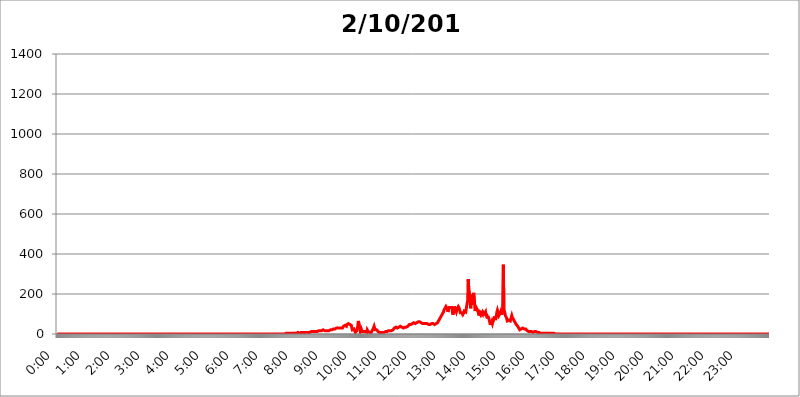
| Category | 2016.02.10 |
|---|---|
| 0.0 | 0 |
| 0.0006944444444444445 | 0 |
| 0.001388888888888889 | 0 |
| 0.0020833333333333333 | 0 |
| 0.002777777777777778 | 0 |
| 0.003472222222222222 | 0 |
| 0.004166666666666667 | 0 |
| 0.004861111111111111 | 0 |
| 0.005555555555555556 | 0 |
| 0.0062499999999999995 | 0 |
| 0.006944444444444444 | 0 |
| 0.007638888888888889 | 0 |
| 0.008333333333333333 | 0 |
| 0.009027777777777779 | 0 |
| 0.009722222222222222 | 0 |
| 0.010416666666666666 | 0 |
| 0.011111111111111112 | 0 |
| 0.011805555555555555 | 0 |
| 0.012499999999999999 | 0 |
| 0.013194444444444444 | 0 |
| 0.013888888888888888 | 0 |
| 0.014583333333333332 | 0 |
| 0.015277777777777777 | 0 |
| 0.015972222222222224 | 0 |
| 0.016666666666666666 | 0 |
| 0.017361111111111112 | 0 |
| 0.018055555555555557 | 0 |
| 0.01875 | 0 |
| 0.019444444444444445 | 0 |
| 0.02013888888888889 | 0 |
| 0.020833333333333332 | 0 |
| 0.02152777777777778 | 0 |
| 0.022222222222222223 | 0 |
| 0.02291666666666667 | 0 |
| 0.02361111111111111 | 0 |
| 0.024305555555555556 | 0 |
| 0.024999999999999998 | 0 |
| 0.025694444444444447 | 0 |
| 0.02638888888888889 | 0 |
| 0.027083333333333334 | 0 |
| 0.027777777777777776 | 0 |
| 0.02847222222222222 | 0 |
| 0.029166666666666664 | 0 |
| 0.029861111111111113 | 0 |
| 0.030555555555555555 | 0 |
| 0.03125 | 0 |
| 0.03194444444444445 | 0 |
| 0.03263888888888889 | 0 |
| 0.03333333333333333 | 0 |
| 0.034027777777777775 | 0 |
| 0.034722222222222224 | 0 |
| 0.035416666666666666 | 0 |
| 0.036111111111111115 | 0 |
| 0.03680555555555556 | 0 |
| 0.0375 | 0 |
| 0.03819444444444444 | 0 |
| 0.03888888888888889 | 0 |
| 0.03958333333333333 | 0 |
| 0.04027777777777778 | 0 |
| 0.04097222222222222 | 0 |
| 0.041666666666666664 | 0 |
| 0.042361111111111106 | 0 |
| 0.04305555555555556 | 0 |
| 0.043750000000000004 | 0 |
| 0.044444444444444446 | 0 |
| 0.04513888888888889 | 0 |
| 0.04583333333333334 | 0 |
| 0.04652777777777778 | 0 |
| 0.04722222222222222 | 0 |
| 0.04791666666666666 | 0 |
| 0.04861111111111111 | 0 |
| 0.049305555555555554 | 0 |
| 0.049999999999999996 | 0 |
| 0.05069444444444445 | 0 |
| 0.051388888888888894 | 0 |
| 0.052083333333333336 | 0 |
| 0.05277777777777778 | 0 |
| 0.05347222222222222 | 0 |
| 0.05416666666666667 | 0 |
| 0.05486111111111111 | 0 |
| 0.05555555555555555 | 0 |
| 0.05625 | 0 |
| 0.05694444444444444 | 0 |
| 0.057638888888888885 | 0 |
| 0.05833333333333333 | 0 |
| 0.05902777777777778 | 0 |
| 0.059722222222222225 | 0 |
| 0.06041666666666667 | 0 |
| 0.061111111111111116 | 0 |
| 0.06180555555555556 | 0 |
| 0.0625 | 0 |
| 0.06319444444444444 | 0 |
| 0.06388888888888888 | 0 |
| 0.06458333333333334 | 0 |
| 0.06527777777777778 | 0 |
| 0.06597222222222222 | 0 |
| 0.06666666666666667 | 0 |
| 0.06736111111111111 | 0 |
| 0.06805555555555555 | 0 |
| 0.06874999999999999 | 0 |
| 0.06944444444444443 | 0 |
| 0.07013888888888889 | 0 |
| 0.07083333333333333 | 0 |
| 0.07152777777777779 | 0 |
| 0.07222222222222223 | 0 |
| 0.07291666666666667 | 0 |
| 0.07361111111111111 | 0 |
| 0.07430555555555556 | 0 |
| 0.075 | 0 |
| 0.07569444444444444 | 0 |
| 0.0763888888888889 | 0 |
| 0.07708333333333334 | 0 |
| 0.07777777777777778 | 0 |
| 0.07847222222222222 | 0 |
| 0.07916666666666666 | 0 |
| 0.0798611111111111 | 0 |
| 0.08055555555555556 | 0 |
| 0.08125 | 0 |
| 0.08194444444444444 | 0 |
| 0.08263888888888889 | 0 |
| 0.08333333333333333 | 0 |
| 0.08402777777777777 | 0 |
| 0.08472222222222221 | 0 |
| 0.08541666666666665 | 0 |
| 0.08611111111111112 | 0 |
| 0.08680555555555557 | 0 |
| 0.08750000000000001 | 0 |
| 0.08819444444444445 | 0 |
| 0.08888888888888889 | 0 |
| 0.08958333333333333 | 0 |
| 0.09027777777777778 | 0 |
| 0.09097222222222222 | 0 |
| 0.09166666666666667 | 0 |
| 0.09236111111111112 | 0 |
| 0.09305555555555556 | 0 |
| 0.09375 | 0 |
| 0.09444444444444444 | 0 |
| 0.09513888888888888 | 0 |
| 0.09583333333333333 | 0 |
| 0.09652777777777777 | 0 |
| 0.09722222222222222 | 0 |
| 0.09791666666666667 | 0 |
| 0.09861111111111111 | 0 |
| 0.09930555555555555 | 0 |
| 0.09999999999999999 | 0 |
| 0.10069444444444443 | 0 |
| 0.1013888888888889 | 0 |
| 0.10208333333333335 | 0 |
| 0.10277777777777779 | 0 |
| 0.10347222222222223 | 0 |
| 0.10416666666666667 | 0 |
| 0.10486111111111111 | 0 |
| 0.10555555555555556 | 0 |
| 0.10625 | 0 |
| 0.10694444444444444 | 0 |
| 0.1076388888888889 | 0 |
| 0.10833333333333334 | 0 |
| 0.10902777777777778 | 0 |
| 0.10972222222222222 | 0 |
| 0.1111111111111111 | 0 |
| 0.11180555555555556 | 0 |
| 0.11180555555555556 | 0 |
| 0.1125 | 0 |
| 0.11319444444444444 | 0 |
| 0.11388888888888889 | 0 |
| 0.11458333333333333 | 0 |
| 0.11527777777777777 | 0 |
| 0.11597222222222221 | 0 |
| 0.11666666666666665 | 0 |
| 0.1173611111111111 | 0 |
| 0.11805555555555557 | 0 |
| 0.11944444444444445 | 0 |
| 0.12013888888888889 | 0 |
| 0.12083333333333333 | 0 |
| 0.12152777777777778 | 0 |
| 0.12222222222222223 | 0 |
| 0.12291666666666667 | 0 |
| 0.12291666666666667 | 0 |
| 0.12361111111111112 | 0 |
| 0.12430555555555556 | 0 |
| 0.125 | 0 |
| 0.12569444444444444 | 0 |
| 0.12638888888888888 | 0 |
| 0.12708333333333333 | 0 |
| 0.16875 | 0 |
| 0.12847222222222224 | 0 |
| 0.12916666666666668 | 0 |
| 0.12986111111111112 | 0 |
| 0.13055555555555556 | 0 |
| 0.13125 | 0 |
| 0.13194444444444445 | 0 |
| 0.1326388888888889 | 0 |
| 0.13333333333333333 | 0 |
| 0.13402777777777777 | 0 |
| 0.13402777777777777 | 0 |
| 0.13472222222222222 | 0 |
| 0.13541666666666666 | 0 |
| 0.1361111111111111 | 0 |
| 0.13749999999999998 | 0 |
| 0.13819444444444443 | 0 |
| 0.1388888888888889 | 0 |
| 0.13958333333333334 | 0 |
| 0.14027777777777778 | 0 |
| 0.14097222222222222 | 0 |
| 0.14166666666666666 | 0 |
| 0.1423611111111111 | 0 |
| 0.14305555555555557 | 0 |
| 0.14375000000000002 | 0 |
| 0.14444444444444446 | 0 |
| 0.1451388888888889 | 0 |
| 0.1451388888888889 | 0 |
| 0.14652777777777778 | 0 |
| 0.14722222222222223 | 0 |
| 0.14791666666666667 | 0 |
| 0.1486111111111111 | 0 |
| 0.14930555555555555 | 0 |
| 0.15 | 0 |
| 0.15069444444444444 | 0 |
| 0.15138888888888888 | 0 |
| 0.15208333333333332 | 0 |
| 0.15277777777777776 | 0 |
| 0.15347222222222223 | 0 |
| 0.15416666666666667 | 0 |
| 0.15486111111111112 | 0 |
| 0.15555555555555556 | 0 |
| 0.15625 | 0 |
| 0.15694444444444444 | 0 |
| 0.15763888888888888 | 0 |
| 0.15833333333333333 | 0 |
| 0.15902777777777777 | 0 |
| 0.15972222222222224 | 0 |
| 0.16041666666666668 | 0 |
| 0.16111111111111112 | 0 |
| 0.16180555555555556 | 0 |
| 0.1625 | 0 |
| 0.16319444444444445 | 0 |
| 0.1638888888888889 | 0 |
| 0.16458333333333333 | 0 |
| 0.16527777777777777 | 0 |
| 0.16597222222222222 | 0 |
| 0.16666666666666666 | 0 |
| 0.1673611111111111 | 0 |
| 0.16805555555555554 | 0 |
| 0.16874999999999998 | 0 |
| 0.16944444444444443 | 0 |
| 0.17013888888888887 | 0 |
| 0.1708333333333333 | 0 |
| 0.17152777777777775 | 0 |
| 0.17222222222222225 | 0 |
| 0.1729166666666667 | 0 |
| 0.17361111111111113 | 0 |
| 0.17430555555555557 | 0 |
| 0.17500000000000002 | 0 |
| 0.17569444444444446 | 0 |
| 0.1763888888888889 | 0 |
| 0.17708333333333334 | 0 |
| 0.17777777777777778 | 0 |
| 0.17847222222222223 | 0 |
| 0.17916666666666667 | 0 |
| 0.1798611111111111 | 0 |
| 0.18055555555555555 | 0 |
| 0.18125 | 0 |
| 0.18194444444444444 | 0 |
| 0.1826388888888889 | 0 |
| 0.18333333333333335 | 0 |
| 0.1840277777777778 | 0 |
| 0.18472222222222223 | 0 |
| 0.18541666666666667 | 0 |
| 0.18611111111111112 | 0 |
| 0.18680555555555556 | 0 |
| 0.1875 | 0 |
| 0.18819444444444444 | 0 |
| 0.18888888888888888 | 0 |
| 0.18958333333333333 | 0 |
| 0.19027777777777777 | 0 |
| 0.1909722222222222 | 0 |
| 0.19166666666666665 | 0 |
| 0.19236111111111112 | 0 |
| 0.19305555555555554 | 0 |
| 0.19375 | 0 |
| 0.19444444444444445 | 0 |
| 0.1951388888888889 | 0 |
| 0.19583333333333333 | 0 |
| 0.19652777777777777 | 0 |
| 0.19722222222222222 | 0 |
| 0.19791666666666666 | 0 |
| 0.1986111111111111 | 0 |
| 0.19930555555555554 | 0 |
| 0.19999999999999998 | 0 |
| 0.20069444444444443 | 0 |
| 0.20138888888888887 | 0 |
| 0.2020833333333333 | 0 |
| 0.2027777777777778 | 0 |
| 0.2034722222222222 | 0 |
| 0.2041666666666667 | 0 |
| 0.20486111111111113 | 0 |
| 0.20555555555555557 | 0 |
| 0.20625000000000002 | 0 |
| 0.20694444444444446 | 0 |
| 0.2076388888888889 | 0 |
| 0.20833333333333334 | 0 |
| 0.20902777777777778 | 0 |
| 0.20972222222222223 | 0 |
| 0.21041666666666667 | 0 |
| 0.2111111111111111 | 0 |
| 0.21180555555555555 | 0 |
| 0.2125 | 0 |
| 0.21319444444444444 | 0 |
| 0.2138888888888889 | 0 |
| 0.21458333333333335 | 0 |
| 0.2152777777777778 | 0 |
| 0.21597222222222223 | 0 |
| 0.21666666666666667 | 0 |
| 0.21736111111111112 | 0 |
| 0.21805555555555556 | 0 |
| 0.21875 | 0 |
| 0.21944444444444444 | 0 |
| 0.22013888888888888 | 0 |
| 0.22083333333333333 | 0 |
| 0.22152777777777777 | 0 |
| 0.2222222222222222 | 0 |
| 0.22291666666666665 | 0 |
| 0.2236111111111111 | 0 |
| 0.22430555555555556 | 0 |
| 0.225 | 0 |
| 0.22569444444444445 | 0 |
| 0.2263888888888889 | 0 |
| 0.22708333333333333 | 0 |
| 0.22777777777777777 | 0 |
| 0.22847222222222222 | 0 |
| 0.22916666666666666 | 0 |
| 0.2298611111111111 | 0 |
| 0.23055555555555554 | 0 |
| 0.23124999999999998 | 0 |
| 0.23194444444444443 | 0 |
| 0.23263888888888887 | 0 |
| 0.2333333333333333 | 0 |
| 0.2340277777777778 | 0 |
| 0.2347222222222222 | 0 |
| 0.2354166666666667 | 0 |
| 0.23611111111111113 | 0 |
| 0.23680555555555557 | 0 |
| 0.23750000000000002 | 0 |
| 0.23819444444444446 | 0 |
| 0.2388888888888889 | 0 |
| 0.23958333333333334 | 0 |
| 0.24027777777777778 | 0 |
| 0.24097222222222223 | 0 |
| 0.24166666666666667 | 0 |
| 0.2423611111111111 | 0 |
| 0.24305555555555555 | 0 |
| 0.24375 | 0 |
| 0.24444444444444446 | 0 |
| 0.24513888888888888 | 0 |
| 0.24583333333333335 | 0 |
| 0.2465277777777778 | 0 |
| 0.24722222222222223 | 0 |
| 0.24791666666666667 | 0 |
| 0.24861111111111112 | 0 |
| 0.24930555555555556 | 0 |
| 0.25 | 0 |
| 0.25069444444444444 | 0 |
| 0.2513888888888889 | 0 |
| 0.2520833333333333 | 0 |
| 0.25277777777777777 | 0 |
| 0.2534722222222222 | 0 |
| 0.25416666666666665 | 0 |
| 0.2548611111111111 | 0 |
| 0.2555555555555556 | 0 |
| 0.25625000000000003 | 0 |
| 0.2569444444444445 | 0 |
| 0.2576388888888889 | 0 |
| 0.25833333333333336 | 0 |
| 0.2590277777777778 | 0 |
| 0.25972222222222224 | 0 |
| 0.2604166666666667 | 0 |
| 0.2611111111111111 | 0 |
| 0.26180555555555557 | 0 |
| 0.2625 | 0 |
| 0.26319444444444445 | 0 |
| 0.2638888888888889 | 0 |
| 0.26458333333333334 | 0 |
| 0.2652777777777778 | 0 |
| 0.2659722222222222 | 0 |
| 0.26666666666666666 | 0 |
| 0.2673611111111111 | 0 |
| 0.26805555555555555 | 0 |
| 0.26875 | 0 |
| 0.26944444444444443 | 0 |
| 0.2701388888888889 | 0 |
| 0.2708333333333333 | 0 |
| 0.27152777777777776 | 0 |
| 0.2722222222222222 | 0 |
| 0.27291666666666664 | 0 |
| 0.2736111111111111 | 0 |
| 0.2743055555555555 | 0 |
| 0.27499999999999997 | 0 |
| 0.27569444444444446 | 0 |
| 0.27638888888888885 | 0 |
| 0.27708333333333335 | 0 |
| 0.2777777777777778 | 0 |
| 0.27847222222222223 | 0 |
| 0.2791666666666667 | 0 |
| 0.2798611111111111 | 0 |
| 0.28055555555555556 | 0 |
| 0.28125 | 0 |
| 0.28194444444444444 | 0 |
| 0.2826388888888889 | 0 |
| 0.2833333333333333 | 0 |
| 0.28402777777777777 | 0 |
| 0.2847222222222222 | 0 |
| 0.28541666666666665 | 0 |
| 0.28611111111111115 | 0 |
| 0.28680555555555554 | 0 |
| 0.28750000000000003 | 0 |
| 0.2881944444444445 | 0 |
| 0.2888888888888889 | 0 |
| 0.28958333333333336 | 0 |
| 0.2902777777777778 | 0 |
| 0.29097222222222224 | 0 |
| 0.2916666666666667 | 0 |
| 0.2923611111111111 | 0 |
| 0.29305555555555557 | 0 |
| 0.29375 | 0 |
| 0.29444444444444445 | 0 |
| 0.2951388888888889 | 0 |
| 0.29583333333333334 | 0 |
| 0.2965277777777778 | 0 |
| 0.2972222222222222 | 0 |
| 0.29791666666666666 | 0 |
| 0.2986111111111111 | 0 |
| 0.29930555555555555 | 0 |
| 0.3 | 0 |
| 0.30069444444444443 | 0 |
| 0.3013888888888889 | 0 |
| 0.3020833333333333 | 0 |
| 0.30277777777777776 | 0 |
| 0.3034722222222222 | 0 |
| 0.30416666666666664 | 0 |
| 0.3048611111111111 | 0 |
| 0.3055555555555555 | 0 |
| 0.30624999999999997 | 0 |
| 0.3069444444444444 | 0 |
| 0.3076388888888889 | 0 |
| 0.30833333333333335 | 0 |
| 0.3090277777777778 | 0 |
| 0.30972222222222223 | 0 |
| 0.3104166666666667 | 0 |
| 0.3111111111111111 | 0 |
| 0.31180555555555556 | 0 |
| 0.3125 | 0 |
| 0.31319444444444444 | 0 |
| 0.3138888888888889 | 0 |
| 0.3145833333333333 | 0 |
| 0.31527777777777777 | 0 |
| 0.3159722222222222 | 0 |
| 0.31666666666666665 | 0 |
| 0.31736111111111115 | 3.525 |
| 0.31805555555555554 | 0 |
| 0.31875000000000003 | 0 |
| 0.3194444444444445 | 0 |
| 0.3201388888888889 | 0 |
| 0.32083333333333336 | 3.525 |
| 0.3215277777777778 | 3.525 |
| 0.32222222222222224 | 3.525 |
| 0.3229166666666667 | 3.525 |
| 0.3236111111111111 | 3.525 |
| 0.32430555555555557 | 3.525 |
| 0.325 | 3.525 |
| 0.32569444444444445 | 0 |
| 0.3263888888888889 | 3.525 |
| 0.32708333333333334 | 3.525 |
| 0.3277777777777778 | 3.525 |
| 0.3284722222222222 | 3.525 |
| 0.32916666666666666 | 3.525 |
| 0.3298611111111111 | 3.525 |
| 0.33055555555555555 | 3.525 |
| 0.33125 | 3.525 |
| 0.33194444444444443 | 3.525 |
| 0.3326388888888889 | 3.525 |
| 0.3333333333333333 | 3.525 |
| 0.3340277777777778 | 3.525 |
| 0.3347222222222222 | 3.525 |
| 0.3354166666666667 | 3.525 |
| 0.3361111111111111 | 7.887 |
| 0.3368055555555556 | 7.887 |
| 0.33749999999999997 | 7.887 |
| 0.33819444444444446 | 7.887 |
| 0.33888888888888885 | 7.887 |
| 0.33958333333333335 | 3.525 |
| 0.34027777777777773 | 7.887 |
| 0.34097222222222223 | 7.887 |
| 0.3416666666666666 | 7.887 |
| 0.3423611111111111 | 7.887 |
| 0.3430555555555555 | 7.887 |
| 0.34375 | 7.887 |
| 0.3444444444444445 | 7.887 |
| 0.3451388888888889 | 7.887 |
| 0.3458333333333334 | 7.887 |
| 0.34652777777777777 | 7.887 |
| 0.34722222222222227 | 7.887 |
| 0.34791666666666665 | 7.887 |
| 0.34861111111111115 | 7.887 |
| 0.34930555555555554 | 7.887 |
| 0.35000000000000003 | 7.887 |
| 0.3506944444444444 | 12.257 |
| 0.3513888888888889 | 12.257 |
| 0.3520833333333333 | 7.887 |
| 0.3527777777777778 | 12.257 |
| 0.3534722222222222 | 12.257 |
| 0.3541666666666667 | 7.887 |
| 0.3548611111111111 | 12.257 |
| 0.35555555555555557 | 12.257 |
| 0.35625 | 12.257 |
| 0.35694444444444445 | 7.887 |
| 0.3576388888888889 | 7.887 |
| 0.35833333333333334 | 12.257 |
| 0.3590277777777778 | 12.257 |
| 0.3597222222222222 | 12.257 |
| 0.36041666666666666 | 12.257 |
| 0.3611111111111111 | 12.257 |
| 0.36180555555555555 | 12.257 |
| 0.3625 | 12.257 |
| 0.36319444444444443 | 16.636 |
| 0.3638888888888889 | 16.636 |
| 0.3645833333333333 | 12.257 |
| 0.3652777777777778 | 12.257 |
| 0.3659722222222222 | 12.257 |
| 0.3666666666666667 | 16.636 |
| 0.3673611111111111 | 16.636 |
| 0.3680555555555556 | 16.636 |
| 0.36874999999999997 | 16.636 |
| 0.36944444444444446 | 16.636 |
| 0.37013888888888885 | 16.636 |
| 0.37083333333333335 | 16.636 |
| 0.37152777777777773 | 16.636 |
| 0.37222222222222223 | 16.636 |
| 0.3729166666666666 | 21.024 |
| 0.3736111111111111 | 21.024 |
| 0.3743055555555555 | 16.636 |
| 0.375 | 16.636 |
| 0.3756944444444445 | 16.636 |
| 0.3763888888888889 | 16.636 |
| 0.3770833333333334 | 16.636 |
| 0.37777777777777777 | 16.636 |
| 0.37847222222222227 | 16.636 |
| 0.37916666666666665 | 16.636 |
| 0.37986111111111115 | 16.636 |
| 0.38055555555555554 | 16.636 |
| 0.38125000000000003 | 16.636 |
| 0.3819444444444444 | 16.636 |
| 0.3826388888888889 | 21.024 |
| 0.3833333333333333 | 21.024 |
| 0.3840277777777778 | 21.024 |
| 0.3847222222222222 | 21.024 |
| 0.3854166666666667 | 21.024 |
| 0.3861111111111111 | 21.024 |
| 0.38680555555555557 | 21.024 |
| 0.3875 | 25.419 |
| 0.38819444444444445 | 25.419 |
| 0.3888888888888889 | 21.024 |
| 0.38958333333333334 | 25.419 |
| 0.3902777777777778 | 25.419 |
| 0.3909722222222222 | 29.823 |
| 0.39166666666666666 | 29.823 |
| 0.3923611111111111 | 25.419 |
| 0.39305555555555555 | 25.419 |
| 0.39375 | 29.823 |
| 0.39444444444444443 | 29.823 |
| 0.3951388888888889 | 29.823 |
| 0.3958333333333333 | 29.823 |
| 0.3965277777777778 | 29.823 |
| 0.3972222222222222 | 29.823 |
| 0.3979166666666667 | 29.823 |
| 0.3986111111111111 | 34.234 |
| 0.3993055555555556 | 29.823 |
| 0.39999999999999997 | 29.823 |
| 0.40069444444444446 | 34.234 |
| 0.40138888888888885 | 38.653 |
| 0.40208333333333335 | 43.079 |
| 0.40277777777777773 | 43.079 |
| 0.40347222222222223 | 43.079 |
| 0.4041666666666666 | 47.511 |
| 0.4048611111111111 | 43.079 |
| 0.4055555555555555 | 38.653 |
| 0.40625 | 47.511 |
| 0.4069444444444445 | 47.511 |
| 0.4076388888888889 | 47.511 |
| 0.4083333333333334 | 51.951 |
| 0.40902777777777777 | 47.511 |
| 0.40972222222222227 | 47.511 |
| 0.41041666666666665 | 47.511 |
| 0.41111111111111115 | 47.511 |
| 0.41180555555555554 | 47.511 |
| 0.41250000000000003 | 43.079 |
| 0.4131944444444444 | 29.823 |
| 0.4138888888888889 | 21.024 |
| 0.4145833333333333 | 16.636 |
| 0.4152777777777778 | 21.024 |
| 0.4159722222222222 | 25.419 |
| 0.4166666666666667 | 29.823 |
| 0.4173611111111111 | 21.024 |
| 0.41805555555555557 | 7.887 |
| 0.41875 | 7.887 |
| 0.41944444444444445 | 7.887 |
| 0.4201388888888889 | 16.636 |
| 0.42083333333333334 | 21.024 |
| 0.4215277777777778 | 38.653 |
| 0.4222222222222222 | 65.31 |
| 0.42291666666666666 | 65.31 |
| 0.4236111111111111 | 43.079 |
| 0.42430555555555555 | 25.419 |
| 0.425 | 12.257 |
| 0.42569444444444443 | 16.636 |
| 0.4263888888888889 | 25.419 |
| 0.4270833333333333 | 29.823 |
| 0.4277777777777778 | 12.257 |
| 0.4284722222222222 | 7.887 |
| 0.4291666666666667 | 7.887 |
| 0.4298611111111111 | 12.257 |
| 0.4305555555555556 | 12.257 |
| 0.43124999999999997 | 12.257 |
| 0.43194444444444446 | 12.257 |
| 0.43263888888888885 | 12.257 |
| 0.43333333333333335 | 7.887 |
| 0.43402777777777773 | 7.887 |
| 0.43472222222222223 | 21.024 |
| 0.4354166666666666 | 16.636 |
| 0.4361111111111111 | 12.257 |
| 0.4368055555555555 | 12.257 |
| 0.4375 | 12.257 |
| 0.4381944444444445 | 7.887 |
| 0.4388888888888889 | 7.887 |
| 0.4395833333333334 | 7.887 |
| 0.44027777777777777 | 7.887 |
| 0.44097222222222227 | 12.257 |
| 0.44166666666666665 | 16.636 |
| 0.44236111111111115 | 21.024 |
| 0.44305555555555554 | 25.419 |
| 0.44375000000000003 | 29.823 |
| 0.4444444444444444 | 38.653 |
| 0.4451388888888889 | 29.823 |
| 0.4458333333333333 | 21.024 |
| 0.4465277777777778 | 21.024 |
| 0.4472222222222222 | 21.024 |
| 0.4479166666666667 | 21.024 |
| 0.4486111111111111 | 16.636 |
| 0.44930555555555557 | 16.636 |
| 0.45 | 12.257 |
| 0.45069444444444445 | 7.887 |
| 0.4513888888888889 | 7.887 |
| 0.45208333333333334 | 7.887 |
| 0.4527777777777778 | 7.887 |
| 0.4534722222222222 | 7.887 |
| 0.45416666666666666 | 7.887 |
| 0.4548611111111111 | 7.887 |
| 0.45555555555555555 | 7.887 |
| 0.45625 | 7.887 |
| 0.45694444444444443 | 7.887 |
| 0.4576388888888889 | 7.887 |
| 0.4583333333333333 | 7.887 |
| 0.4590277777777778 | 7.887 |
| 0.4597222222222222 | 7.887 |
| 0.4604166666666667 | 12.257 |
| 0.4611111111111111 | 12.257 |
| 0.4618055555555556 | 12.257 |
| 0.46249999999999997 | 12.257 |
| 0.46319444444444446 | 12.257 |
| 0.46388888888888885 | 16.636 |
| 0.46458333333333335 | 16.636 |
| 0.46527777777777773 | 16.636 |
| 0.46597222222222223 | 16.636 |
| 0.4666666666666666 | 16.636 |
| 0.4673611111111111 | 16.636 |
| 0.4680555555555555 | 16.636 |
| 0.46875 | 16.636 |
| 0.4694444444444445 | 21.024 |
| 0.4701388888888889 | 21.024 |
| 0.4708333333333334 | 21.024 |
| 0.47152777777777777 | 25.419 |
| 0.47222222222222227 | 25.419 |
| 0.47291666666666665 | 29.823 |
| 0.47361111111111115 | 29.823 |
| 0.47430555555555554 | 34.234 |
| 0.47500000000000003 | 34.234 |
| 0.4756944444444444 | 34.234 |
| 0.4763888888888889 | 34.234 |
| 0.4770833333333333 | 29.823 |
| 0.4777777777777778 | 29.823 |
| 0.4784722222222222 | 29.823 |
| 0.4791666666666667 | 34.234 |
| 0.4798611111111111 | 34.234 |
| 0.48055555555555557 | 38.653 |
| 0.48125 | 38.653 |
| 0.48194444444444445 | 38.653 |
| 0.4826388888888889 | 34.234 |
| 0.48333333333333334 | 34.234 |
| 0.4840277777777778 | 34.234 |
| 0.4847222222222222 | 34.234 |
| 0.48541666666666666 | 29.823 |
| 0.4861111111111111 | 29.823 |
| 0.48680555555555555 | 29.823 |
| 0.4875 | 34.234 |
| 0.48819444444444443 | 34.234 |
| 0.4888888888888889 | 34.234 |
| 0.4895833333333333 | 34.234 |
| 0.4902777777777778 | 34.234 |
| 0.4909722222222222 | 38.653 |
| 0.4916666666666667 | 38.653 |
| 0.4923611111111111 | 43.079 |
| 0.4930555555555556 | 43.079 |
| 0.49374999999999997 | 47.511 |
| 0.49444444444444446 | 47.511 |
| 0.49513888888888885 | 47.511 |
| 0.49583333333333335 | 47.511 |
| 0.49652777777777773 | 51.951 |
| 0.49722222222222223 | 51.951 |
| 0.4979166666666666 | 51.951 |
| 0.4986111111111111 | 51.951 |
| 0.4993055555555555 | 51.951 |
| 0.5 | 56.398 |
| 0.5006944444444444 | 51.951 |
| 0.5013888888888889 | 51.951 |
| 0.5020833333333333 | 51.951 |
| 0.5027777777777778 | 51.951 |
| 0.5034722222222222 | 51.951 |
| 0.5041666666666667 | 56.398 |
| 0.5048611111111111 | 56.398 |
| 0.5055555555555555 | 60.85 |
| 0.50625 | 60.85 |
| 0.5069444444444444 | 60.85 |
| 0.5076388888888889 | 60.85 |
| 0.5083333333333333 | 60.85 |
| 0.5090277777777777 | 56.398 |
| 0.5097222222222222 | 56.398 |
| 0.5104166666666666 | 56.398 |
| 0.5111111111111112 | 56.398 |
| 0.5118055555555555 | 56.398 |
| 0.5125000000000001 | 51.951 |
| 0.5131944444444444 | 51.951 |
| 0.513888888888889 | 51.951 |
| 0.5145833333333333 | 51.951 |
| 0.5152777777777778 | 51.951 |
| 0.5159722222222222 | 51.951 |
| 0.5166666666666667 | 51.951 |
| 0.517361111111111 | 51.951 |
| 0.5180555555555556 | 51.951 |
| 0.5187499999999999 | 51.951 |
| 0.5194444444444445 | 47.511 |
| 0.5201388888888888 | 47.511 |
| 0.5208333333333334 | 47.511 |
| 0.5215277777777778 | 47.511 |
| 0.5222222222222223 | 47.511 |
| 0.5229166666666667 | 47.511 |
| 0.5236111111111111 | 47.511 |
| 0.5243055555555556 | 47.511 |
| 0.525 | 51.951 |
| 0.5256944444444445 | 51.951 |
| 0.5263888888888889 | 51.951 |
| 0.5270833333333333 | 51.951 |
| 0.5277777777777778 | 51.951 |
| 0.5284722222222222 | 51.951 |
| 0.5291666666666667 | 47.511 |
| 0.5298611111111111 | 47.511 |
| 0.5305555555555556 | 47.511 |
| 0.53125 | 51.951 |
| 0.5319444444444444 | 56.398 |
| 0.5326388888888889 | 56.398 |
| 0.5333333333333333 | 56.398 |
| 0.5340277777777778 | 60.85 |
| 0.5347222222222222 | 65.31 |
| 0.5354166666666667 | 69.775 |
| 0.5361111111111111 | 69.775 |
| 0.5368055555555555 | 78.722 |
| 0.5375 | 83.205 |
| 0.5381944444444444 | 87.692 |
| 0.5388888888888889 | 92.184 |
| 0.5395833333333333 | 96.682 |
| 0.5402777777777777 | 96.682 |
| 0.5409722222222222 | 101.184 |
| 0.5416666666666666 | 110.201 |
| 0.5423611111111112 | 119.235 |
| 0.5430555555555555 | 123.758 |
| 0.5437500000000001 | 128.284 |
| 0.5444444444444444 | 132.814 |
| 0.545138888888889 | 137.347 |
| 0.5458333333333333 | 141.884 |
| 0.5465277777777778 | 141.884 |
| 0.5472222222222222 | 123.758 |
| 0.5479166666666667 | 110.201 |
| 0.548611111111111 | 119.235 |
| 0.5493055555555556 | 132.814 |
| 0.5499999999999999 | 137.347 |
| 0.5506944444444445 | 137.347 |
| 0.5513888888888888 | 132.814 |
| 0.5520833333333334 | 132.814 |
| 0.5527777777777778 | 137.347 |
| 0.5534722222222223 | 132.814 |
| 0.5541666666666667 | 114.716 |
| 0.5548611111111111 | 96.682 |
| 0.5555555555555556 | 101.184 |
| 0.55625 | 119.235 |
| 0.5569444444444445 | 137.347 |
| 0.5576388888888889 | 132.814 |
| 0.5583333333333333 | 123.758 |
| 0.5590277777777778 | 119.235 |
| 0.5597222222222222 | 110.201 |
| 0.5604166666666667 | 114.716 |
| 0.5611111111111111 | 128.284 |
| 0.5618055555555556 | 128.284 |
| 0.5625 | 137.347 |
| 0.5631944444444444 | 137.347 |
| 0.5638888888888889 | 128.284 |
| 0.5645833333333333 | 119.235 |
| 0.5652777777777778 | 105.69 |
| 0.5659722222222222 | 105.69 |
| 0.5666666666666667 | 110.201 |
| 0.5673611111111111 | 105.69 |
| 0.5680555555555555 | 101.184 |
| 0.56875 | 96.682 |
| 0.5694444444444444 | 101.184 |
| 0.5701388888888889 | 105.69 |
| 0.5708333333333333 | 114.716 |
| 0.5715277777777777 | 110.201 |
| 0.5722222222222222 | 119.235 |
| 0.5729166666666666 | 110.201 |
| 0.5736111111111112 | 114.716 |
| 0.5743055555555555 | 141.884 |
| 0.5750000000000001 | 137.347 |
| 0.5756944444444444 | 169.156 |
| 0.576388888888889 | 274.047 |
| 0.5770833333333333 | 233 |
| 0.5777777777777778 | 228.436 |
| 0.5784722222222222 | 196.497 |
| 0.5791666666666667 | 155.509 |
| 0.579861111111111 | 128.284 |
| 0.5805555555555556 | 164.605 |
| 0.5812499999999999 | 196.497 |
| 0.5819444444444445 | 146.423 |
| 0.5826388888888888 | 169.156 |
| 0.5833333333333334 | 196.497 |
| 0.5840277777777778 | 205.62 |
| 0.5847222222222223 | 201.058 |
| 0.5854166666666667 | 146.423 |
| 0.5861111111111111 | 114.716 |
| 0.5868055555555556 | 110.201 |
| 0.5875 | 132.814 |
| 0.5881944444444445 | 132.814 |
| 0.5888888888888889 | 123.758 |
| 0.5895833333333333 | 119.235 |
| 0.5902777777777778 | 110.201 |
| 0.5909722222222222 | 101.184 |
| 0.5916666666666667 | 92.184 |
| 0.5923611111111111 | 105.69 |
| 0.5930555555555556 | 110.201 |
| 0.59375 | 96.682 |
| 0.5944444444444444 | 105.69 |
| 0.5951388888888889 | 101.184 |
| 0.5958333333333333 | 110.201 |
| 0.5965277777777778 | 96.682 |
| 0.5972222222222222 | 110.201 |
| 0.5979166666666667 | 110.201 |
| 0.5986111111111111 | 110.201 |
| 0.5993055555555555 | 101.184 |
| 0.6 | 96.682 |
| 0.6006944444444444 | 110.201 |
| 0.6013888888888889 | 92.184 |
| 0.6020833333333333 | 101.184 |
| 0.6027777777777777 | 83.205 |
| 0.6034722222222222 | 87.692 |
| 0.6041666666666666 | 83.205 |
| 0.6048611111111112 | 83.205 |
| 0.6055555555555555 | 74.246 |
| 0.6062500000000001 | 65.31 |
| 0.6069444444444444 | 51.951 |
| 0.607638888888889 | 51.951 |
| 0.6083333333333333 | 47.511 |
| 0.6090277777777778 | 51.951 |
| 0.6097222222222222 | 60.85 |
| 0.6104166666666667 | 51.951 |
| 0.611111111111111 | 60.85 |
| 0.6118055555555556 | 65.31 |
| 0.6124999999999999 | 74.246 |
| 0.6131944444444445 | 87.692 |
| 0.6138888888888888 | 83.205 |
| 0.6145833333333334 | 69.775 |
| 0.6152777777777778 | 74.246 |
| 0.6159722222222223 | 92.184 |
| 0.6166666666666667 | 110.201 |
| 0.6173611111111111 | 119.235 |
| 0.6180555555555556 | 110.201 |
| 0.61875 | 105.69 |
| 0.6194444444444445 | 92.184 |
| 0.6201388888888889 | 92.184 |
| 0.6208333333333333 | 101.184 |
| 0.6215277777777778 | 101.184 |
| 0.6222222222222222 | 114.716 |
| 0.6229166666666667 | 105.69 |
| 0.6236111111111111 | 96.682 |
| 0.6243055555555556 | 114.716 |
| 0.625 | 105.69 |
| 0.6256944444444444 | 346.682 |
| 0.6263888888888889 | 123.758 |
| 0.6270833333333333 | 119.235 |
| 0.6277777777777778 | 105.69 |
| 0.6284722222222222 | 92.184 |
| 0.6291666666666667 | 87.692 |
| 0.6298611111111111 | 83.205 |
| 0.6305555555555555 | 74.246 |
| 0.63125 | 65.31 |
| 0.6319444444444444 | 60.85 |
| 0.6326388888888889 | 69.775 |
| 0.6333333333333333 | 69.775 |
| 0.6340277777777777 | 65.31 |
| 0.6347222222222222 | 65.31 |
| 0.6354166666666666 | 65.31 |
| 0.6361111111111112 | 74.246 |
| 0.6368055555555555 | 78.722 |
| 0.6375000000000001 | 92.184 |
| 0.6381944444444444 | 83.205 |
| 0.638888888888889 | 78.722 |
| 0.6395833333333333 | 74.246 |
| 0.6402777777777778 | 69.775 |
| 0.6409722222222222 | 65.31 |
| 0.6416666666666667 | 60.85 |
| 0.642361111111111 | 56.398 |
| 0.6430555555555556 | 51.951 |
| 0.6437499999999999 | 47.511 |
| 0.6444444444444445 | 43.079 |
| 0.6451388888888888 | 43.079 |
| 0.6458333333333334 | 38.653 |
| 0.6465277777777778 | 34.234 |
| 0.6472222222222223 | 29.823 |
| 0.6479166666666667 | 25.419 |
| 0.6486111111111111 | 21.024 |
| 0.6493055555555556 | 21.024 |
| 0.65 | 25.419 |
| 0.6506944444444445 | 25.419 |
| 0.6513888888888889 | 25.419 |
| 0.6520833333333333 | 29.823 |
| 0.6527777777777778 | 29.823 |
| 0.6534722222222222 | 25.419 |
| 0.6541666666666667 | 25.419 |
| 0.6548611111111111 | 25.419 |
| 0.6555555555555556 | 25.419 |
| 0.65625 | 21.024 |
| 0.6569444444444444 | 25.419 |
| 0.6576388888888889 | 21.024 |
| 0.6583333333333333 | 21.024 |
| 0.6590277777777778 | 16.636 |
| 0.6597222222222222 | 12.257 |
| 0.6604166666666667 | 12.257 |
| 0.6611111111111111 | 12.257 |
| 0.6618055555555555 | 12.257 |
| 0.6625 | 12.257 |
| 0.6631944444444444 | 12.257 |
| 0.6638888888888889 | 12.257 |
| 0.6645833333333333 | 12.257 |
| 0.6652777777777777 | 12.257 |
| 0.6659722222222222 | 12.257 |
| 0.6666666666666666 | 7.887 |
| 0.6673611111111111 | 7.887 |
| 0.6680555555555556 | 7.887 |
| 0.6687500000000001 | 12.257 |
| 0.6694444444444444 | 12.257 |
| 0.6701388888888888 | 12.257 |
| 0.6708333333333334 | 12.257 |
| 0.6715277777777778 | 12.257 |
| 0.6722222222222222 | 7.887 |
| 0.6729166666666666 | 7.887 |
| 0.6736111111111112 | 7.887 |
| 0.6743055555555556 | 7.887 |
| 0.6749999999999999 | 7.887 |
| 0.6756944444444444 | 7.887 |
| 0.6763888888888889 | 7.887 |
| 0.6770833333333334 | 3.525 |
| 0.6777777777777777 | 3.525 |
| 0.6784722222222223 | 7.887 |
| 0.6791666666666667 | 3.525 |
| 0.6798611111111111 | 3.525 |
| 0.6805555555555555 | 7.887 |
| 0.68125 | 3.525 |
| 0.6819444444444445 | 3.525 |
| 0.6826388888888889 | 3.525 |
| 0.6833333333333332 | 3.525 |
| 0.6840277777777778 | 3.525 |
| 0.6847222222222222 | 3.525 |
| 0.6854166666666667 | 3.525 |
| 0.686111111111111 | 3.525 |
| 0.6868055555555556 | 3.525 |
| 0.6875 | 3.525 |
| 0.6881944444444444 | 3.525 |
| 0.688888888888889 | 3.525 |
| 0.6895833333333333 | 3.525 |
| 0.6902777777777778 | 3.525 |
| 0.6909722222222222 | 3.525 |
| 0.6916666666666668 | 3.525 |
| 0.6923611111111111 | 3.525 |
| 0.6930555555555555 | 3.525 |
| 0.69375 | 3.525 |
| 0.6944444444444445 | 3.525 |
| 0.6951388888888889 | 3.525 |
| 0.6958333333333333 | 3.525 |
| 0.6965277777777777 | 3.525 |
| 0.6972222222222223 | 0 |
| 0.6979166666666666 | 0 |
| 0.6986111111111111 | 0 |
| 0.6993055555555556 | 0 |
| 0.7000000000000001 | 0 |
| 0.7006944444444444 | 0 |
| 0.7013888888888888 | 0 |
| 0.7020833333333334 | 0 |
| 0.7027777777777778 | 0 |
| 0.7034722222222222 | 0 |
| 0.7041666666666666 | 0 |
| 0.7048611111111112 | 0 |
| 0.7055555555555556 | 0 |
| 0.7062499999999999 | 0 |
| 0.7069444444444444 | 0 |
| 0.7076388888888889 | 0 |
| 0.7083333333333334 | 0 |
| 0.7090277777777777 | 0 |
| 0.7097222222222223 | 0 |
| 0.7104166666666667 | 0 |
| 0.7111111111111111 | 0 |
| 0.7118055555555555 | 0 |
| 0.7125 | 0 |
| 0.7131944444444445 | 0 |
| 0.7138888888888889 | 0 |
| 0.7145833333333332 | 0 |
| 0.7152777777777778 | 0 |
| 0.7159722222222222 | 0 |
| 0.7166666666666667 | 0 |
| 0.717361111111111 | 0 |
| 0.7180555555555556 | 0 |
| 0.71875 | 0 |
| 0.7194444444444444 | 0 |
| 0.720138888888889 | 0 |
| 0.7208333333333333 | 0 |
| 0.7215277777777778 | 0 |
| 0.7222222222222222 | 0 |
| 0.7229166666666668 | 0 |
| 0.7236111111111111 | 0 |
| 0.7243055555555555 | 0 |
| 0.725 | 0 |
| 0.7256944444444445 | 0 |
| 0.7263888888888889 | 0 |
| 0.7270833333333333 | 0 |
| 0.7277777777777777 | 0 |
| 0.7284722222222223 | 0 |
| 0.7291666666666666 | 0 |
| 0.7298611111111111 | 0 |
| 0.7305555555555556 | 0 |
| 0.7312500000000001 | 0 |
| 0.7319444444444444 | 0 |
| 0.7326388888888888 | 0 |
| 0.7333333333333334 | 0 |
| 0.7340277777777778 | 0 |
| 0.7347222222222222 | 0 |
| 0.7354166666666666 | 0 |
| 0.7361111111111112 | 0 |
| 0.7368055555555556 | 0 |
| 0.7374999999999999 | 0 |
| 0.7381944444444444 | 0 |
| 0.7388888888888889 | 0 |
| 0.7395833333333334 | 0 |
| 0.7402777777777777 | 0 |
| 0.7409722222222223 | 0 |
| 0.7416666666666667 | 0 |
| 0.7423611111111111 | 0 |
| 0.7430555555555555 | 0 |
| 0.74375 | 0 |
| 0.7444444444444445 | 0 |
| 0.7451388888888889 | 0 |
| 0.7458333333333332 | 0 |
| 0.7465277777777778 | 0 |
| 0.7472222222222222 | 0 |
| 0.7479166666666667 | 0 |
| 0.748611111111111 | 0 |
| 0.7493055555555556 | 0 |
| 0.75 | 0 |
| 0.7506944444444444 | 0 |
| 0.751388888888889 | 0 |
| 0.7520833333333333 | 0 |
| 0.7527777777777778 | 0 |
| 0.7534722222222222 | 0 |
| 0.7541666666666668 | 0 |
| 0.7548611111111111 | 0 |
| 0.7555555555555555 | 0 |
| 0.75625 | 0 |
| 0.7569444444444445 | 0 |
| 0.7576388888888889 | 0 |
| 0.7583333333333333 | 0 |
| 0.7590277777777777 | 0 |
| 0.7597222222222223 | 0 |
| 0.7604166666666666 | 0 |
| 0.7611111111111111 | 0 |
| 0.7618055555555556 | 0 |
| 0.7625000000000001 | 0 |
| 0.7631944444444444 | 0 |
| 0.7638888888888888 | 0 |
| 0.7645833333333334 | 0 |
| 0.7652777777777778 | 0 |
| 0.7659722222222222 | 0 |
| 0.7666666666666666 | 0 |
| 0.7673611111111112 | 0 |
| 0.7680555555555556 | 0 |
| 0.7687499999999999 | 0 |
| 0.7694444444444444 | 0 |
| 0.7701388888888889 | 0 |
| 0.7708333333333334 | 0 |
| 0.7715277777777777 | 0 |
| 0.7722222222222223 | 0 |
| 0.7729166666666667 | 0 |
| 0.7736111111111111 | 0 |
| 0.7743055555555555 | 0 |
| 0.775 | 0 |
| 0.7756944444444445 | 0 |
| 0.7763888888888889 | 0 |
| 0.7770833333333332 | 0 |
| 0.7777777777777778 | 0 |
| 0.7784722222222222 | 0 |
| 0.7791666666666667 | 0 |
| 0.779861111111111 | 0 |
| 0.7805555555555556 | 0 |
| 0.78125 | 0 |
| 0.7819444444444444 | 0 |
| 0.782638888888889 | 0 |
| 0.7833333333333333 | 0 |
| 0.7840277777777778 | 0 |
| 0.7847222222222222 | 0 |
| 0.7854166666666668 | 0 |
| 0.7861111111111111 | 0 |
| 0.7868055555555555 | 0 |
| 0.7875 | 0 |
| 0.7881944444444445 | 0 |
| 0.7888888888888889 | 0 |
| 0.7895833333333333 | 0 |
| 0.7902777777777777 | 0 |
| 0.7909722222222223 | 0 |
| 0.7916666666666666 | 0 |
| 0.7923611111111111 | 0 |
| 0.7930555555555556 | 0 |
| 0.7937500000000001 | 0 |
| 0.7944444444444444 | 0 |
| 0.7951388888888888 | 0 |
| 0.7958333333333334 | 0 |
| 0.7965277777777778 | 0 |
| 0.7972222222222222 | 0 |
| 0.7979166666666666 | 0 |
| 0.7986111111111112 | 0 |
| 0.7993055555555556 | 0 |
| 0.7999999999999999 | 0 |
| 0.8006944444444444 | 0 |
| 0.8013888888888889 | 0 |
| 0.8020833333333334 | 0 |
| 0.8027777777777777 | 0 |
| 0.8034722222222223 | 0 |
| 0.8041666666666667 | 0 |
| 0.8048611111111111 | 0 |
| 0.8055555555555555 | 0 |
| 0.80625 | 0 |
| 0.8069444444444445 | 0 |
| 0.8076388888888889 | 0 |
| 0.8083333333333332 | 0 |
| 0.8090277777777778 | 0 |
| 0.8097222222222222 | 0 |
| 0.8104166666666667 | 0 |
| 0.811111111111111 | 0 |
| 0.8118055555555556 | 0 |
| 0.8125 | 0 |
| 0.8131944444444444 | 0 |
| 0.813888888888889 | 0 |
| 0.8145833333333333 | 0 |
| 0.8152777777777778 | 0 |
| 0.8159722222222222 | 0 |
| 0.8166666666666668 | 0 |
| 0.8173611111111111 | 0 |
| 0.8180555555555555 | 0 |
| 0.81875 | 0 |
| 0.8194444444444445 | 0 |
| 0.8201388888888889 | 0 |
| 0.8208333333333333 | 0 |
| 0.8215277777777777 | 0 |
| 0.8222222222222223 | 0 |
| 0.8229166666666666 | 0 |
| 0.8236111111111111 | 0 |
| 0.8243055555555556 | 0 |
| 0.8250000000000001 | 0 |
| 0.8256944444444444 | 0 |
| 0.8263888888888888 | 0 |
| 0.8270833333333334 | 0 |
| 0.8277777777777778 | 0 |
| 0.8284722222222222 | 0 |
| 0.8291666666666666 | 0 |
| 0.8298611111111112 | 0 |
| 0.8305555555555556 | 0 |
| 0.8312499999999999 | 0 |
| 0.8319444444444444 | 0 |
| 0.8326388888888889 | 0 |
| 0.8333333333333334 | 0 |
| 0.8340277777777777 | 0 |
| 0.8347222222222223 | 0 |
| 0.8354166666666667 | 0 |
| 0.8361111111111111 | 0 |
| 0.8368055555555555 | 0 |
| 0.8375 | 0 |
| 0.8381944444444445 | 0 |
| 0.8388888888888889 | 0 |
| 0.8395833333333332 | 0 |
| 0.8402777777777778 | 0 |
| 0.8409722222222222 | 0 |
| 0.8416666666666667 | 0 |
| 0.842361111111111 | 0 |
| 0.8430555555555556 | 0 |
| 0.84375 | 0 |
| 0.8444444444444444 | 0 |
| 0.845138888888889 | 0 |
| 0.8458333333333333 | 0 |
| 0.8465277777777778 | 0 |
| 0.8472222222222222 | 0 |
| 0.8479166666666668 | 0 |
| 0.8486111111111111 | 0 |
| 0.8493055555555555 | 0 |
| 0.85 | 0 |
| 0.8506944444444445 | 0 |
| 0.8513888888888889 | 0 |
| 0.8520833333333333 | 0 |
| 0.8527777777777777 | 0 |
| 0.8534722222222223 | 0 |
| 0.8541666666666666 | 0 |
| 0.8548611111111111 | 0 |
| 0.8555555555555556 | 0 |
| 0.8562500000000001 | 0 |
| 0.8569444444444444 | 0 |
| 0.8576388888888888 | 0 |
| 0.8583333333333334 | 0 |
| 0.8590277777777778 | 0 |
| 0.8597222222222222 | 0 |
| 0.8604166666666666 | 0 |
| 0.8611111111111112 | 0 |
| 0.8618055555555556 | 0 |
| 0.8624999999999999 | 0 |
| 0.8631944444444444 | 0 |
| 0.8638888888888889 | 0 |
| 0.8645833333333334 | 0 |
| 0.8652777777777777 | 0 |
| 0.8659722222222223 | 0 |
| 0.8666666666666667 | 0 |
| 0.8673611111111111 | 0 |
| 0.8680555555555555 | 0 |
| 0.86875 | 0 |
| 0.8694444444444445 | 0 |
| 0.8701388888888889 | 0 |
| 0.8708333333333332 | 0 |
| 0.8715277777777778 | 0 |
| 0.8722222222222222 | 0 |
| 0.8729166666666667 | 0 |
| 0.873611111111111 | 0 |
| 0.8743055555555556 | 0 |
| 0.875 | 0 |
| 0.8756944444444444 | 0 |
| 0.876388888888889 | 0 |
| 0.8770833333333333 | 0 |
| 0.8777777777777778 | 0 |
| 0.8784722222222222 | 0 |
| 0.8791666666666668 | 0 |
| 0.8798611111111111 | 0 |
| 0.8805555555555555 | 0 |
| 0.88125 | 0 |
| 0.8819444444444445 | 0 |
| 0.8826388888888889 | 0 |
| 0.8833333333333333 | 0 |
| 0.8840277777777777 | 0 |
| 0.8847222222222223 | 0 |
| 0.8854166666666666 | 0 |
| 0.8861111111111111 | 0 |
| 0.8868055555555556 | 0 |
| 0.8875000000000001 | 0 |
| 0.8881944444444444 | 0 |
| 0.8888888888888888 | 0 |
| 0.8895833333333334 | 0 |
| 0.8902777777777778 | 0 |
| 0.8909722222222222 | 0 |
| 0.8916666666666666 | 0 |
| 0.8923611111111112 | 0 |
| 0.8930555555555556 | 0 |
| 0.8937499999999999 | 0 |
| 0.8944444444444444 | 0 |
| 0.8951388888888889 | 0 |
| 0.8958333333333334 | 0 |
| 0.8965277777777777 | 0 |
| 0.8972222222222223 | 0 |
| 0.8979166666666667 | 0 |
| 0.8986111111111111 | 0 |
| 0.8993055555555555 | 0 |
| 0.9 | 0 |
| 0.9006944444444445 | 0 |
| 0.9013888888888889 | 0 |
| 0.9020833333333332 | 0 |
| 0.9027777777777778 | 0 |
| 0.9034722222222222 | 0 |
| 0.9041666666666667 | 0 |
| 0.904861111111111 | 0 |
| 0.9055555555555556 | 0 |
| 0.90625 | 0 |
| 0.9069444444444444 | 0 |
| 0.907638888888889 | 0 |
| 0.9083333333333333 | 0 |
| 0.9090277777777778 | 0 |
| 0.9097222222222222 | 0 |
| 0.9104166666666668 | 0 |
| 0.9111111111111111 | 0 |
| 0.9118055555555555 | 0 |
| 0.9125 | 0 |
| 0.9131944444444445 | 0 |
| 0.9138888888888889 | 0 |
| 0.9145833333333333 | 0 |
| 0.9152777777777777 | 0 |
| 0.9159722222222223 | 0 |
| 0.9166666666666666 | 0 |
| 0.9173611111111111 | 0 |
| 0.9180555555555556 | 0 |
| 0.9187500000000001 | 0 |
| 0.9194444444444444 | 0 |
| 0.9201388888888888 | 0 |
| 0.9208333333333334 | 0 |
| 0.9215277777777778 | 0 |
| 0.9222222222222222 | 0 |
| 0.9229166666666666 | 0 |
| 0.9236111111111112 | 0 |
| 0.9243055555555556 | 0 |
| 0.9249999999999999 | 0 |
| 0.9256944444444444 | 0 |
| 0.9263888888888889 | 0 |
| 0.9270833333333334 | 0 |
| 0.9277777777777777 | 0 |
| 0.9284722222222223 | 0 |
| 0.9291666666666667 | 0 |
| 0.9298611111111111 | 0 |
| 0.9305555555555555 | 0 |
| 0.93125 | 0 |
| 0.9319444444444445 | 0 |
| 0.9326388888888889 | 0 |
| 0.9333333333333332 | 0 |
| 0.9340277777777778 | 0 |
| 0.9347222222222222 | 0 |
| 0.9354166666666667 | 0 |
| 0.936111111111111 | 0 |
| 0.9368055555555556 | 0 |
| 0.9375 | 0 |
| 0.9381944444444444 | 0 |
| 0.938888888888889 | 0 |
| 0.9395833333333333 | 0 |
| 0.9402777777777778 | 0 |
| 0.9409722222222222 | 0 |
| 0.9416666666666668 | 0 |
| 0.9423611111111111 | 0 |
| 0.9430555555555555 | 0 |
| 0.94375 | 0 |
| 0.9444444444444445 | 0 |
| 0.9451388888888889 | 0 |
| 0.9458333333333333 | 0 |
| 0.9465277777777777 | 0 |
| 0.9472222222222223 | 0 |
| 0.9479166666666666 | 0 |
| 0.9486111111111111 | 0 |
| 0.9493055555555556 | 0 |
| 0.9500000000000001 | 0 |
| 0.9506944444444444 | 0 |
| 0.9513888888888888 | 0 |
| 0.9520833333333334 | 0 |
| 0.9527777777777778 | 0 |
| 0.9534722222222222 | 0 |
| 0.9541666666666666 | 0 |
| 0.9548611111111112 | 0 |
| 0.9555555555555556 | 0 |
| 0.9562499999999999 | 0 |
| 0.9569444444444444 | 0 |
| 0.9576388888888889 | 0 |
| 0.9583333333333334 | 0 |
| 0.9590277777777777 | 0 |
| 0.9597222222222223 | 0 |
| 0.9604166666666667 | 0 |
| 0.9611111111111111 | 0 |
| 0.9618055555555555 | 0 |
| 0.9625 | 0 |
| 0.9631944444444445 | 0 |
| 0.9638888888888889 | 0 |
| 0.9645833333333332 | 0 |
| 0.9652777777777778 | 0 |
| 0.9659722222222222 | 0 |
| 0.9666666666666667 | 0 |
| 0.967361111111111 | 0 |
| 0.9680555555555556 | 0 |
| 0.96875 | 0 |
| 0.9694444444444444 | 0 |
| 0.970138888888889 | 0 |
| 0.9708333333333333 | 0 |
| 0.9715277777777778 | 0 |
| 0.9722222222222222 | 0 |
| 0.9729166666666668 | 0 |
| 0.9736111111111111 | 0 |
| 0.9743055555555555 | 0 |
| 0.975 | 0 |
| 0.9756944444444445 | 0 |
| 0.9763888888888889 | 0 |
| 0.9770833333333333 | 0 |
| 0.9777777777777777 | 0 |
| 0.9784722222222223 | 0 |
| 0.9791666666666666 | 0 |
| 0.9798611111111111 | 0 |
| 0.9805555555555556 | 0 |
| 0.9812500000000001 | 0 |
| 0.9819444444444444 | 0 |
| 0.9826388888888888 | 0 |
| 0.9833333333333334 | 0 |
| 0.9840277777777778 | 0 |
| 0.9847222222222222 | 0 |
| 0.9854166666666666 | 0 |
| 0.9861111111111112 | 0 |
| 0.9868055555555556 | 0 |
| 0.9874999999999999 | 0 |
| 0.9881944444444444 | 0 |
| 0.9888888888888889 | 0 |
| 0.9895833333333334 | 0 |
| 0.9902777777777777 | 0 |
| 0.9909722222222223 | 0 |
| 0.9916666666666667 | 0 |
| 0.9923611111111111 | 0 |
| 0.9930555555555555 | 0 |
| 0.99375 | 0 |
| 0.9944444444444445 | 0 |
| 0.9951388888888889 | 0 |
| 0.9958333333333332 | 0 |
| 0.9965277777777778 | 0 |
| 0.9972222222222222 | 0 |
| 0.9979166666666667 | 0 |
| 0.998611111111111 | 0 |
| 0.9993055555555556 | 0 |